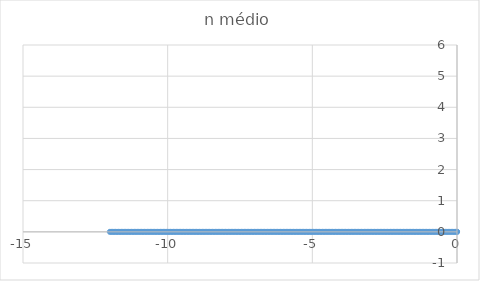
| Category | n médio |
|---|---|
| -12.0 | 0 |
| -11.95 | 0 |
| -11.899999999999999 | 0 |
| -11.849999999999998 | 0 |
| -11.799999999999997 | 0 |
| -11.749999999999996 | 0 |
| -11.699999999999996 | 0 |
| -11.649999999999995 | 0 |
| -11.599999999999994 | 0 |
| -11.549999999999994 | 0 |
| -11.499999999999993 | 0 |
| -11.449999999999992 | 0 |
| -11.399999999999991 | 0 |
| -11.34999999999999 | 0 |
| -11.29999999999999 | 0 |
| -11.24999999999999 | 0 |
| -11.199999999999989 | 0 |
| -11.149999999999988 | 0 |
| -11.099999999999987 | 0 |
| -11.049999999999986 | 0 |
| -10.999999999999986 | 0 |
| -10.949999999999985 | 0 |
| -10.899999999999984 | 0 |
| -10.849999999999984 | 0 |
| -10.799999999999983 | 0 |
| -10.749999999999982 | 0 |
| -10.699999999999982 | 0 |
| -10.64999999999998 | 0 |
| -10.59999999999998 | 0 |
| -10.54999999999998 | 0 |
| -10.499999999999979 | 0 |
| -10.449999999999978 | 0 |
| -10.399999999999977 | 0 |
| -10.349999999999977 | 0 |
| -10.299999999999976 | 0 |
| -10.249999999999975 | 0 |
| -10.199999999999974 | 0 |
| -10.149999999999974 | 0 |
| -10.099999999999973 | 0 |
| -10.049999999999972 | 0 |
| -9.999999999999972 | 0 |
| -9.94999999999997 | 0 |
| -9.89999999999997 | 0 |
| -9.84999999999997 | 0 |
| -9.799999999999969 | 0 |
| -9.749999999999968 | 0 |
| -9.699999999999967 | 0 |
| -9.649999999999967 | 0 |
| -9.599999999999966 | 0 |
| -9.549999999999965 | 0 |
| -9.499999999999964 | 0 |
| -9.449999999999964 | 0 |
| -9.399999999999963 | 0 |
| -9.349999999999962 | 0 |
| -9.299999999999962 | 0 |
| -9.249999999999961 | 0 |
| -9.19999999999996 | 0 |
| -9.14999999999996 | 0 |
| -9.099999999999959 | 0 |
| -9.049999999999958 | 0 |
| -8.999999999999957 | 0 |
| -8.949999999999957 | 0 |
| -8.899999999999956 | 0 |
| -8.849999999999955 | 0 |
| -8.799999999999955 | 0 |
| -8.749999999999954 | 0 |
| -8.699999999999953 | 0 |
| -8.649999999999952 | 0 |
| -8.599999999999952 | 0 |
| -8.549999999999951 | 0 |
| -8.49999999999995 | 0 |
| -8.44999999999995 | 0 |
| -8.399999999999949 | 0 |
| -8.349999999999948 | 0 |
| -8.299999999999947 | 0 |
| -8.249999999999947 | 0 |
| -8.199999999999946 | 0 |
| -8.149999999999945 | 0 |
| -8.099999999999945 | 0 |
| -8.049999999999944 | 0 |
| -7.999999999999944 | 0 |
| -7.949999999999944 | 0 |
| -7.899999999999944 | 0 |
| -7.849999999999945 | 0 |
| -7.799999999999945 | 0 |
| -7.749999999999945 | 0 |
| -7.699999999999945 | 0 |
| -7.649999999999945 | 0 |
| -7.5999999999999455 | 0 |
| -7.549999999999946 | 0 |
| -7.499999999999946 | 0 |
| -7.449999999999946 | 0 |
| -7.399999999999946 | 0 |
| -7.349999999999946 | 0 |
| -7.2999999999999465 | 0 |
| -7.249999999999947 | 0 |
| -7.199999999999947 | 0 |
| -7.149999999999947 | 0 |
| -7.099999999999947 | 0 |
| -7.049999999999947 | 0 |
| -6.999999999999948 | 0 |
| -6.949999999999948 | 0 |
| -6.899999999999948 | 0 |
| -6.849999999999948 | 0 |
| -6.799999999999948 | 0 |
| -6.7499999999999485 | 0 |
| -6.699999999999949 | 0 |
| -6.649999999999949 | 0 |
| -6.599999999999949 | 0 |
| -6.549999999999949 | 0 |
| -6.499999999999949 | 0 |
| -6.4499999999999496 | 0 |
| -6.39999999999995 | 0 |
| -6.34999999999995 | 0 |
| -6.29999999999995 | 0 |
| -6.24999999999995 | 0 |
| -6.19999999999995 | 0 |
| -6.149999999999951 | 0 |
| -6.099999999999951 | 0 |
| -6.049999999999951 | 0 |
| -5.999999999999951 | 0 |
| -5.949999999999951 | 0 |
| -5.8999999999999515 | 0 |
| -5.849999999999952 | 0 |
| -5.799999999999952 | 0 |
| -5.749999999999952 | 0 |
| -5.699999999999952 | 0 |
| -5.649999999999952 | 0 |
| -5.599999999999953 | 0 |
| -5.549999999999953 | 0 |
| -5.499999999999953 | 0 |
| -5.449999999999953 | 0 |
| -5.399999999999953 | 0 |
| -5.3499999999999535 | 0 |
| -5.299999999999954 | 0 |
| -5.249999999999954 | 0 |
| -5.199999999999954 | 0 |
| -5.149999999999954 | 0 |
| -5.099999999999954 | 0 |
| -5.0499999999999545 | 0 |
| -4.999999999999955 | 0 |
| -4.949999999999955 | 0 |
| -4.899999999999955 | 0 |
| -4.849999999999955 | 0 |
| -4.799999999999955 | 0 |
| -4.749999999999956 | 0 |
| -4.699999999999956 | 0 |
| -4.649999999999956 | 0 |
| -4.599999999999956 | 0 |
| -4.549999999999956 | 0 |
| -4.4999999999999565 | 0 |
| -4.449999999999957 | 0 |
| -4.399999999999957 | 0 |
| -4.349999999999957 | 0 |
| -4.299999999999957 | 0 |
| -4.249999999999957 | 0 |
| -4.1999999999999575 | 0 |
| -4.149999999999958 | 0 |
| -4.099999999999958 | 0 |
| -4.049999999999958 | 0 |
| -3.9999999999999583 | 0 |
| -3.9499999999999584 | 0 |
| -3.8999999999999586 | 0 |
| -3.849999999999959 | 0 |
| -3.799999999999959 | 0 |
| -3.749999999999959 | 0 |
| -3.6999999999999593 | 0 |
| -3.6499999999999595 | 0 |
| -3.5999999999999597 | 0 |
| -3.54999999999996 | 0 |
| -3.49999999999996 | 0 |
| -3.44999999999996 | 0 |
| -3.3999999999999604 | 0 |
| -3.3499999999999606 | 0 |
| -3.2999999999999607 | 0 |
| -3.249999999999961 | 0 |
| -3.199999999999961 | 0 |
| -3.1499999999999613 | 0 |
| -3.0999999999999615 | 0 |
| -3.0499999999999616 | 0 |
| -2.999999999999962 | 0 |
| -2.949999999999962 | 0 |
| -2.899999999999962 | 0 |
| -2.8499999999999623 | 0 |
| -2.7999999999999625 | 0 |
| -2.7499999999999627 | 0 |
| -2.699999999999963 | 0 |
| -2.649999999999963 | 0 |
| -2.5999999999999632 | 0 |
| -2.5499999999999634 | 0 |
| -2.4999999999999636 | 0 |
| -2.4499999999999638 | 0 |
| -2.399999999999964 | 0 |
| -2.349999999999964 | 0 |
| -2.2999999999999643 | 0 |
| -2.2499999999999645 | 0 |
| -2.1999999999999647 | 0 |
| -2.149999999999965 | 0 |
| -2.099999999999965 | 0 |
| -2.049999999999965 | 0 |
| -1.9999999999999651 | 0 |
| -1.949999999999965 | 0 |
| -1.899999999999965 | 0 |
| -1.849999999999965 | 0 |
| -1.799999999999965 | 0 |
| -1.749999999999965 | 0 |
| -1.6999999999999649 | 0 |
| -1.6499999999999648 | 0 |
| -1.5999999999999648 | 0 |
| -1.5499999999999647 | 0 |
| -1.4999999999999647 | 0 |
| -1.4499999999999647 | 0 |
| -1.3999999999999646 | 0 |
| -1.3499999999999646 | 0 |
| -1.2999999999999645 | 0 |
| -1.2499999999999645 | 0 |
| -1.1999999999999644 | 0 |
| -1.1499999999999644 | 0 |
| -1.0999999999999643 | 0 |
| -1.0499999999999643 | 0 |
| -0.9999999999999643 | 0 |
| -0.9499999999999642 | 0 |
| -0.8999999999999642 | 0 |
| -0.8499999999999641 | 0 |
| -0.7999999999999641 | 0 |
| -0.749999999999964 | 0 |
| -0.699999999999964 | 0 |
| -0.6499999999999639 | 0 |
| -0.5999999999999639 | 0 |
| -0.5499999999999639 | 0 |
| -0.49999999999996386 | 0 |
| -0.4499999999999639 | 0 |
| -0.3999999999999639 | 0 |
| -0.3499999999999639 | 0 |
| -0.2999999999999639 | 0 |
| -0.24999999999996392 | 0 |
| -0.19999999999996393 | 0 |
| -0.14999999999996394 | 0 |
| -0.09999999999996394 | 0 |
| -0.049999999999963934 | 0 |
| 3.606837051250977e-14 | 0 |
| 0.05000000000003607 | 0 |
| 0.10000000000003607 | 0 |
| 0.15000000000003608 | 0 |
| 0.2000000000000361 | 0 |
| 0.2500000000000361 | 0 |
| 0.30000000000003607 | 0 |
| 0.35000000000003606 | 0 |
| 0.40000000000003605 | 0 |
| 0.45000000000003604 | 0 |
| 0.5000000000000361 | 0 |
| 0.5500000000000361 | 0 |
| 0.6000000000000362 | 0 |
| 0.6500000000000362 | 0 |
| 0.7000000000000363 | 0 |
| 0.7500000000000363 | 0 |
| 0.8000000000000363 | 0 |
| 0.8500000000000364 | 0 |
| 0.9000000000000364 | 0 |
| 0.9500000000000365 | 0 |
| 0.0 | 0 |
| 0.05 | 0 |
| 0.1 | 0 |
| 0.15000000000000002 | 0 |
| 0.2 | 0 |
| 0.25 | 0 |
| 0.3 | 0 |
| 0.35 | 0 |
| 0.39999999999999997 | 0 |
| 0.44999999999999996 | 0 |
| 0.49999999999999994 | 0 |
| 0.5499999999999999 | 0 |
| 0.6 | 0 |
| 0.65 | 0 |
| 0.7000000000000001 | 0 |
| 0.7500000000000001 | 0 |
| 0.8000000000000002 | 0 |
| 0.8500000000000002 | 0 |
| 0.9000000000000002 | 0 |
| 0.9500000000000003 | 0 |
| 1.0000000000000002 | 0 |
| 0.0 | 0 |
| 0.05 | 0 |
| 0.1 | 0 |
| 0.15000000000000002 | 0 |
| 0.2 | 0 |
| 0.25 | 0 |
| 0.3 | 0 |
| 0.35 | 0 |
| 0.39999999999999997 | 0 |
| 0.44999999999999996 | 0 |
| 0.49999999999999994 | 0 |
| 0.5499999999999999 | 0 |
| 0.6 | 0 |